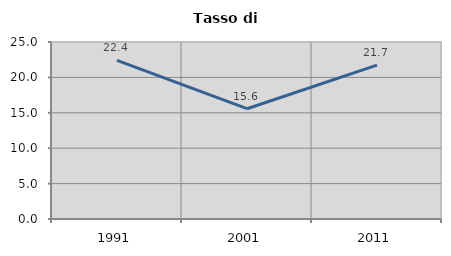
| Category | Tasso di disoccupazione   |
|---|---|
| 1991.0 | 22.404 |
| 2001.0 | 15.578 |
| 2011.0 | 21.743 |